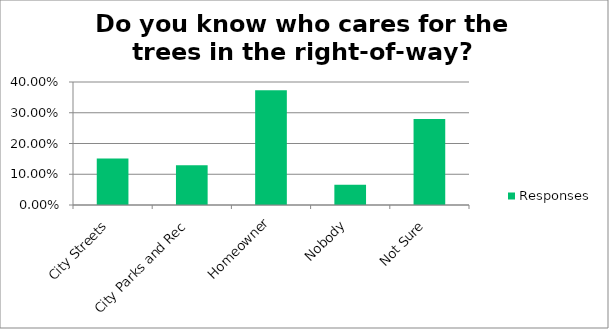
| Category | Responses |
|---|---|
| City Streets | 0.151 |
| City Parks and Rec | 0.129 |
| Homeowner | 0.374 |
| Nobody | 0.066 |
| Not Sure | 0.28 |